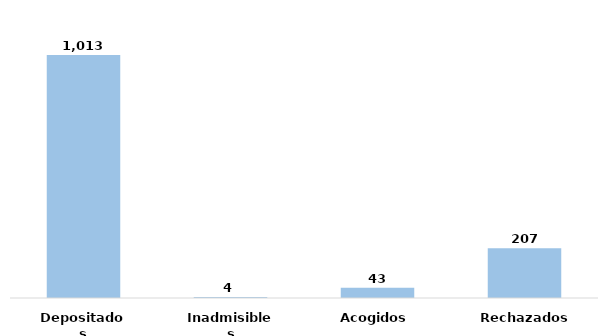
| Category | Series 0 |
|---|---|
| Depositados | 1013 |
| Inadmisibles | 4 |
| Acogidos | 43 |
| Rechazados | 207 |